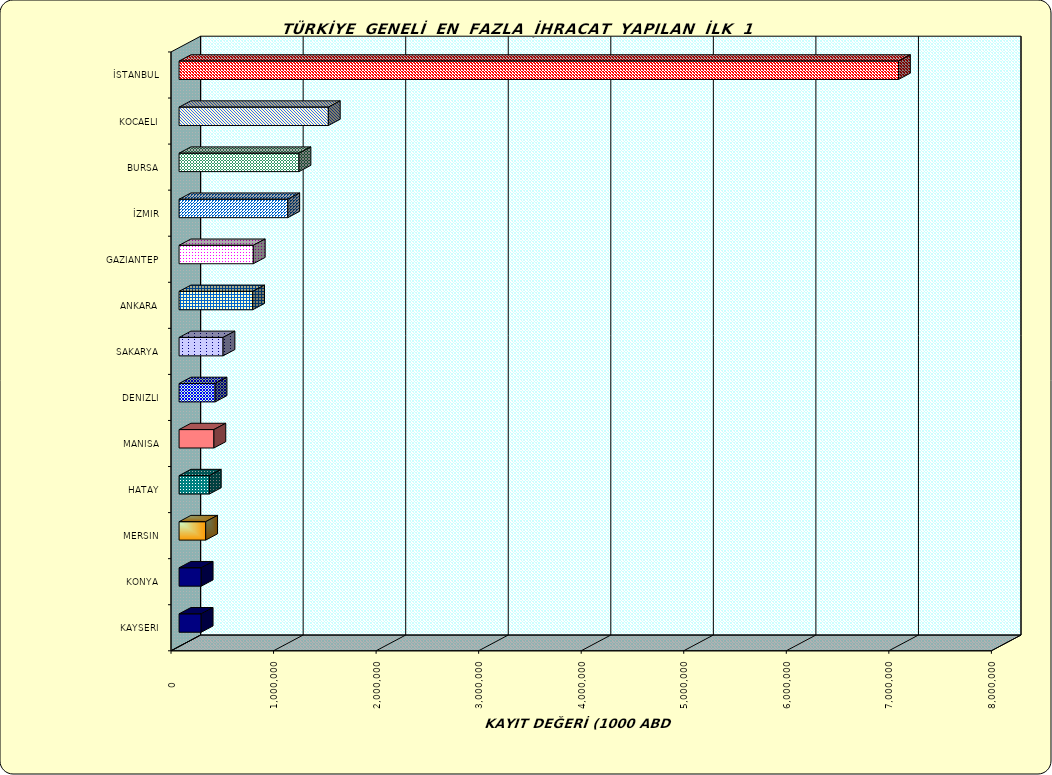
| Category | Series 0 |
|---|---|
| İSTANBUL | 7015594.363 |
| KOCAELI | 1455602.956 |
| BURSA | 1169668.089 |
| İZMIR | 1060206.277 |
| GAZIANTEP | 723767.115 |
| ANKARA | 717630.66 |
| SAKARYA | 428680.739 |
| DENIZLI | 351509.664 |
| MANISA | 339733.142 |
| HATAY | 295096.245 |
| MERSIN | 259600.219 |
| KONYA | 216005.661 |
| KAYSERI | 215808.212 |